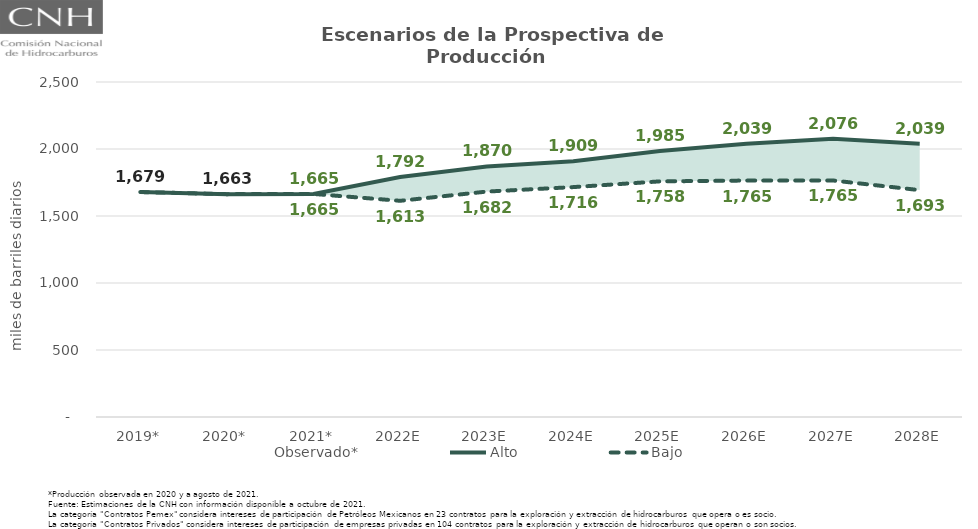
| Category | Observado* | Alto | Bajo |
|---|---|---|---|
| 2019* | 1678.832 | 1678.832 | 1678.832 |
| 2020* | 1663.043 | 1663.043 | 1663.043 |
| 2021* | 1664.708 | 1664.708 | 1664.708 |
| 2022E | 1729.81 | 1791.537 | 1613.412 |
| 2023E | 1799.458 | 1869.509 | 1682.214 |
| 2024E | 1830.777 | 1909.273 | 1715.692 |
| 2025E | 1867.354 | 1984.629 | 1758.436 |
| 2026E | 1876.537 | 2038.798 | 1764.603 |
| 2027E | 1866.595 | 2075.785 | 1765.024 |
| 2028E | 1783.438 | 2038.833 | 1693.1 |